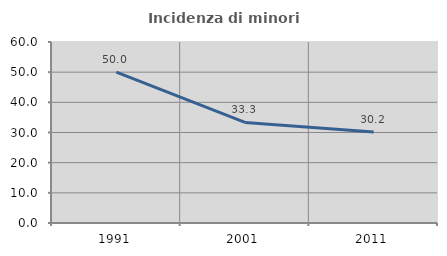
| Category | Incidenza di minori stranieri |
|---|---|
| 1991.0 | 50 |
| 2001.0 | 33.333 |
| 2011.0 | 30.159 |